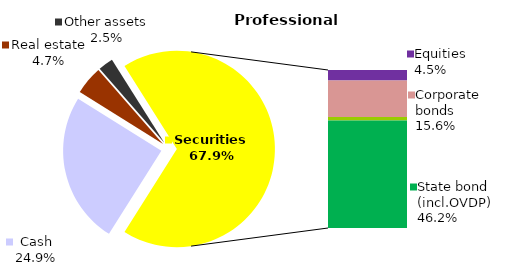
| Category | Professional |
|---|---|
| Cash | 37.367 |
| Bank metals | 0 |
| Real estate | 7.006 |
| Other assets | 3.725 |
| Equities | 6.813 |
| Corporate bonds | 23.405 |
| Municipal bonds | 2.364 |
| State bond (incl.OVDP) | 69.228 |